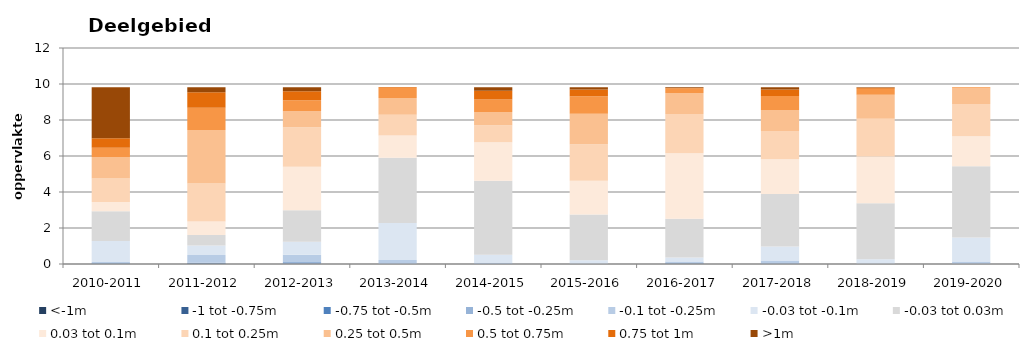
| Category | <-1m | -1 tot -0.75m | -0.75 tot -0.5m | -0.5 tot -0.25m | -0.1 tot -0.25m | -0.03 tot -0.1m | -0.03 tot 0.03m | 0.03 tot 0.1m | 0.1 tot 0.25m | 0.25 tot 0.5m | 0.5 tot 0.75m | 0.75 tot 1m | >1m |
|---|---|---|---|---|---|---|---|---|---|---|---|---|---|
| 2010-2011 | 0 | 0.018 | 0.016 | 0.014 | 0.066 | 1.17 | 1.652 | 0.512 | 1.297 | 1.199 | 0.511 | 0.531 | 2.831 |
| 2011-2012 | 0.013 | 0.01 | 0.02 | 0.034 | 0.428 | 0.524 | 0.576 | 0.755 | 2.119 | 2.972 | 1.23 | 0.856 | 0.284 |
| 2012-2013 | 0.012 | 0.005 | 0.013 | 0.08 | 0.405 | 0.725 | 1.74 | 2.42 | 2.198 | 0.888 | 0.616 | 0.495 | 0.222 |
| 2013-2014 | 0 | 0 | 0 | 0.006 | 0.21 | 2.06 | 3.621 | 1.249 | 1.147 | 0.923 | 0.563 | 0.042 | 0 |
| 2014-2015 | 0 | 0 | 0 | 0.002 | 0.053 | 0.459 | 4.106 | 2.144 | 0.942 | 0.734 | 0.705 | 0.487 | 0.189 |
| 2015-2016 | 0 | 0 | 0.001 | 0.004 | 0.02 | 0.18 | 2.547 | 1.875 | 2.019 | 1.697 | 0.982 | 0.363 | 0.132 |
| 2016-2017 | 0.007 | 0.007 | 0.011 | 0.023 | 0.092 | 0.22 | 2.158 | 3.636 | 2.178 | 1.169 | 0.243 | 0.035 | 0.041 |
| 2017-2018 | 0 | 0.002 | 0.004 | 0.031 | 0.159 | 0.782 | 2.908 | 1.932 | 1.571 | 1.174 | 0.777 | 0.351 | 0.13 |
| 2018-2019 | 0 | 0 | 0 | 0.004 | 0.021 | 0.242 | 3.11 | 2.59 | 2.103 | 1.33 | 0.342 | 0.055 | 0.023 |
| 2019-2020 | 0 | 0 | 0.001 | 0.016 | 0.125 | 1.332 | 3.958 | 1.667 | 1.796 | 0.868 | 0.057 | 0 | 0 |